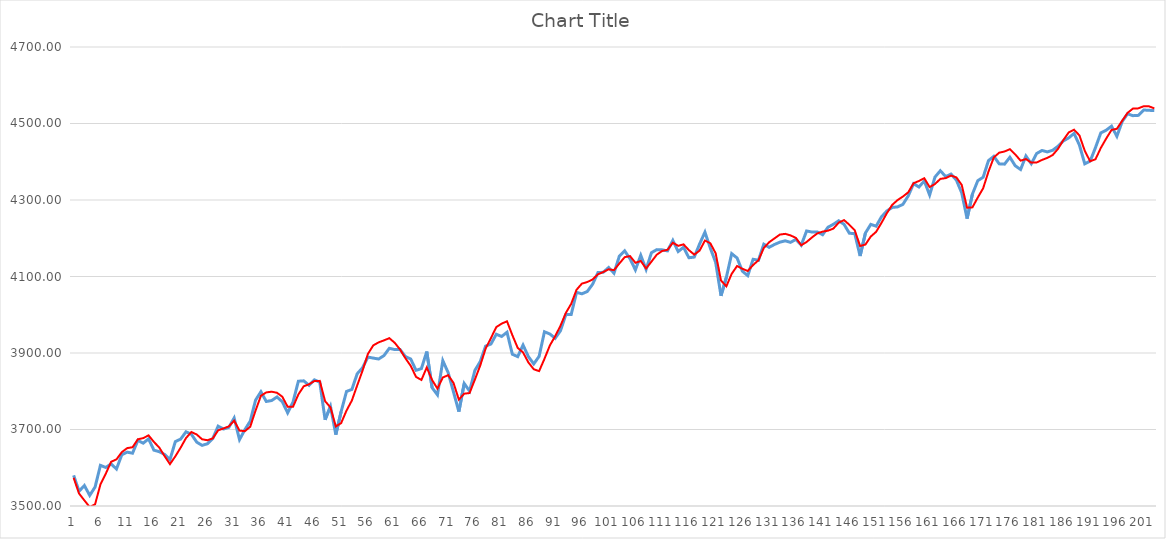
| Category | Series 0 | Series 1 |
|---|---|---|
| 0 | 3580.25 | 3573.625 |
| 1 | 3538.5 | 3532.718 |
| 2 | 3553.5 | 3514.727 |
| 3 | 3527.75 | 3497.147 |
| 4 | 3549.5 | 3504.381 |
| 5 | 3606.25 | 3556.171 |
| 6 | 3600.75 | 3584.471 |
| 7 | 3610 | 3615.608 |
| 8 | 3596.75 | 3621.951 |
| 9 | 3634 | 3640.724 |
| 10 | 3640.75 | 3651.377 |
| 11 | 3638 | 3653.598 |
| 12 | 3671.5 | 3674.405 |
| 13 | 3664.25 | 3677.503 |
| 14 | 3675.5 | 3684.626 |
| 15 | 3646 | 3667.448 |
| 16 | 3642 | 3652.815 |
| 17 | 3634.75 | 3630.329 |
| 18 | 3621.25 | 3609.48 |
| 19 | 3668.25 | 3629.872 |
| 20 | 3675 | 3652.653 |
| 21 | 3694 | 3677.684 |
| 22 | 3687.5 | 3693.385 |
| 23 | 3667 | 3686.95 |
| 24 | 3658.5 | 3674.443 |
| 25 | 3662.75 | 3671.953 |
| 26 | 3676.25 | 3676.64 |
| 27 | 3708.75 | 3697.814 |
| 28 | 3701.25 | 3702.689 |
| 29 | 3705.5 | 3708.074 |
| 30 | 3730.05 | 3723.121 |
| 31 | 3673.5 | 3697.081 |
| 32 | 3699.5 | 3695.692 |
| 33 | 3721.75 | 3707.227 |
| 34 | 3776.75 | 3749.446 |
| 35 | 3798.75 | 3788.088 |
| 36 | 3773.25 | 3796.973 |
| 37 | 3775.75 | 3798.8 |
| 38 | 3785 | 3796.051 |
| 39 | 3772.5 | 3785.629 |
| 40 | 3743.5 | 3759.384 |
| 41 | 3771.75 | 3759.263 |
| 42 | 3826.25 | 3791.58 |
| 43 | 3827.25 | 3812.986 |
| 44 | 3815.5 | 3818.228 |
| 45 | 3829.75 | 3826.869 |
| 46 | 3823.75 | 3827.118 |
| 47 | 3725.5 | 3774.007 |
| 48 | 3760.5 | 3757.77 |
| 49 | 3686.5 | 3708.002 |
| 50 | 3747 | 3716.755 |
| 51 | 3799.5 | 3749.494 |
| 52 | 3804.75 | 3775.764 |
| 53 | 3845.75 | 3815.297 |
| 54 | 3861.5 | 3854.093 |
| 55 | 3889.25 | 3897.61 |
| 56 | 3886.75 | 3919.895 |
| 57 | 3884.25 | 3927.812 |
| 58 | 3893.25 | 3932.99 |
| 59 | 3912.25 | 3938.8 |
| 60 | 3909 | 3926.778 |
| 61 | 3909.25 | 3909.486 |
| 62 | 3890.75 | 3886.467 |
| 63 | 3884.25 | 3866.439 |
| 64 | 3854.75 | 3837.462 |
| 65 | 3859.25 | 3829.554 |
| 66 | 3903.75 | 3862.119 |
| 67 | 3809.25 | 3829.453 |
| 68 | 3790.5 | 3806.879 |
| 69 | 3880 | 3835.975 |
| 70 | 3848.75 | 3842.002 |
| 71 | 3798 | 3821.839 |
| 72 | 3746.75 | 3778.169 |
| 73 | 3820.25 | 3793.659 |
| 74 | 3800.5 | 3795.301 |
| 75 | 3854.5 | 3830.663 |
| 76 | 3877.75 | 3867.457 |
| 77 | 3918 | 3911.417 |
| 78 | 3923.5 | 3939.158 |
| 79 | 3949 | 3967.705 |
| 80 | 3943.25 | 3976.808 |
| 81 | 3954.25 | 3982.875 |
| 82 | 3896.75 | 3946.68 |
| 83 | 3890.5 | 3913.388 |
| 84 | 3920.75 | 3901.451 |
| 85 | 3890.5 | 3875.299 |
| 86 | 3871.5 | 3857.52 |
| 87 | 3891.25 | 3852.6 |
| 88 | 3955.5 | 3884.694 |
| 89 | 3949.75 | 3919.52 |
| 90 | 3938.5 | 3943.801 |
| 91 | 3958.25 | 3971.456 |
| 92 | 4000.75 | 4004.83 |
| 93 | 4000.75 | 4028.612 |
| 94 | 4058.5 | 4065.386 |
| 95 | 4054.75 | 4081.436 |
| 96 | 4060.75 | 4085.491 |
| 97 | 4079.75 | 4092.305 |
| 98 | 4110.25 | 4105.71 |
| 99 | 4111 | 4111.703 |
| 100 | 4123.5 | 4118.788 |
| 101 | 4108.75 | 4116.681 |
| 102 | 4153.25 | 4133.995 |
| 103 | 4167 | 4150.552 |
| 104 | 4146.25 | 4153.323 |
| 105 | 4117.25 | 4135.831 |
| 106 | 4155.5 | 4140.609 |
| 107 | 4118.5 | 4120.915 |
| 108 | 4162.25 | 4138.881 |
| 109 | 4170.25 | 4157.113 |
| 110 | 4169.75 | 4166.722 |
| 111 | 4167 | 4169.774 |
| 112 | 4194.25 | 4188.353 |
| 113 | 4165.25 | 4180.182 |
| 114 | 4176.5 | 4184.038 |
| 115 | 4149 | 4168.956 |
| 116 | 4150.75 | 4157.227 |
| 117 | 4185 | 4167.632 |
| 118 | 4216 | 4194.043 |
| 119 | 4174.25 | 4187.035 |
| 120 | 4137 | 4160.774 |
| 121 | 4049.5 | 4089.584 |
| 122 | 4097.75 | 4074.259 |
| 123 | 4159.75 | 4107.03 |
| 124 | 4148.5 | 4127.305 |
| 125 | 4113.75 | 4120.217 |
| 126 | 4102.25 | 4114.424 |
| 127 | 4145 | 4130.091 |
| 128 | 4142.5 | 4142.42 |
| 129 | 4184.5 | 4174.56 |
| 130 | 4176.25 | 4189.608 |
| 131 | 4183.75 | 4199.612 |
| 132 | 4189.75 | 4209.595 |
| 133 | 4193.25 | 4211.51 |
| 134 | 4189.25 | 4207.483 |
| 135 | 4197 | 4200.894 |
| 136 | 4182 | 4181.682 |
| 137 | 4219 | 4190.239 |
| 138 | 4216.25 | 4202.066 |
| 139 | 4216.5 | 4212.733 |
| 140 | 4209.25 | 4217.341 |
| 141 | 4228.75 | 4219.78 |
| 142 | 4236.5 | 4225.222 |
| 143 | 4245.75 | 4240.647 |
| 144 | 4236.5 | 4247.544 |
| 145 | 4213 | 4235.097 |
| 146 | 4212.25 | 4220.902 |
| 147 | 4153.5 | 4179.617 |
| 148 | 4213.75 | 4183.641 |
| 149 | 4236.25 | 4204.547 |
| 150 | 4231.5 | 4216.815 |
| 151 | 4256 | 4240.251 |
| 152 | 4271.25 | 4265.43 |
| 153 | 4280.5 | 4287.189 |
| 154 | 4282 | 4299.744 |
| 155 | 4288.5 | 4308.948 |
| 156 | 4310.75 | 4320.063 |
| 157 | 4342.75 | 4343.828 |
| 158 | 4334 | 4349.719 |
| 159 | 4349.75 | 4356.883 |
| 160 | 4313 | 4333.806 |
| 161 | 4360 | 4341.708 |
| 162 | 4376.5 | 4355.187 |
| 163 | 4361.25 | 4357.249 |
| 164 | 4367.75 | 4363.792 |
| 165 | 4352 | 4359.165 |
| 166 | 4318.5 | 4339.361 |
| 167 | 4251.25 | 4279.851 |
| 168 | 4315.5 | 4280.752 |
| 169 | 4350.5 | 4306.57 |
| 170 | 4359.5 | 4330.548 |
| 171 | 4403 | 4374.268 |
| 172 | 4414.25 | 4411.299 |
| 173 | 4394.5 | 4423.682 |
| 174 | 4393.75 | 4426.831 |
| 175 | 4411.75 | 4432.787 |
| 176 | 4389.5 | 4419.227 |
| 177 | 4379.75 | 4402.867 |
| 178 | 4415 | 4407.056 |
| 179 | 4394.75 | 4397.693 |
| 180 | 4421.5 | 4398.084 |
| 181 | 4429.5 | 4404.696 |
| 182 | 4425.75 | 4410.138 |
| 183 | 4430 | 4417.517 |
| 184 | 4440.5 | 4433.789 |
| 185 | 4454.5 | 4456.842 |
| 186 | 4462.5 | 4476.667 |
| 187 | 4474 | 4483.685 |
| 188 | 4443.5 | 4468.892 |
| 189 | 4394.5 | 4428.542 |
| 190 | 4401.5 | 4401.231 |
| 191 | 4437 | 4406.528 |
| 192 | 4475.5 | 4436.177 |
| 193 | 4482.5 | 4460.54 |
| 194 | 4493 | 4483.177 |
| 195 | 4466.5 | 4486.13 |
| 196 | 4505.5 | 4507.166 |
| 197 | 4525.25 | 4527.758 |
| 198 | 4520.5 | 4538.921 |
| 199 | 4521.25 | 4539.566 |
| 200 | 4535.25 | 4545.075 |
| 201 | 4534.5 | 4544.909 |
| 202 | 4533.75 | 4539.505 |